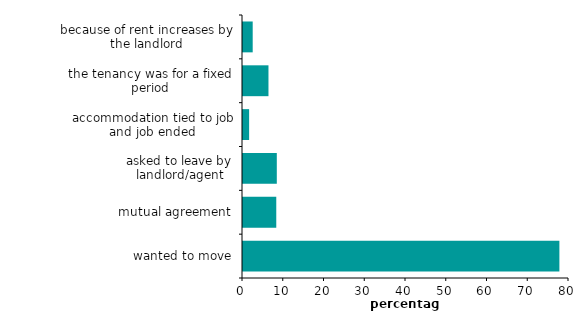
| Category | Series 0 |
|---|---|
| wanted to move | 77.642 |
| mutual agreement | 8.165 |
| asked to leave by landlord/agent | 8.296 |
| accommodation tied to job and job ended | 1.5 |
| the tenancy was for a fixed period | 6.251 |
| because of rent increases by the landlord | 2.381 |